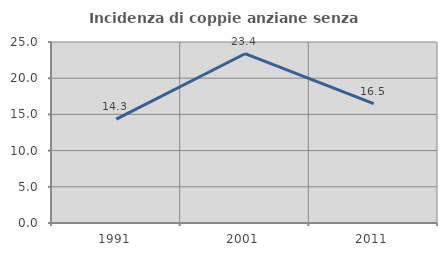
| Category | Incidenza di coppie anziane senza figli  |
|---|---|
| 1991.0 | 14.336 |
| 2001.0 | 23.381 |
| 2011.0 | 16.484 |